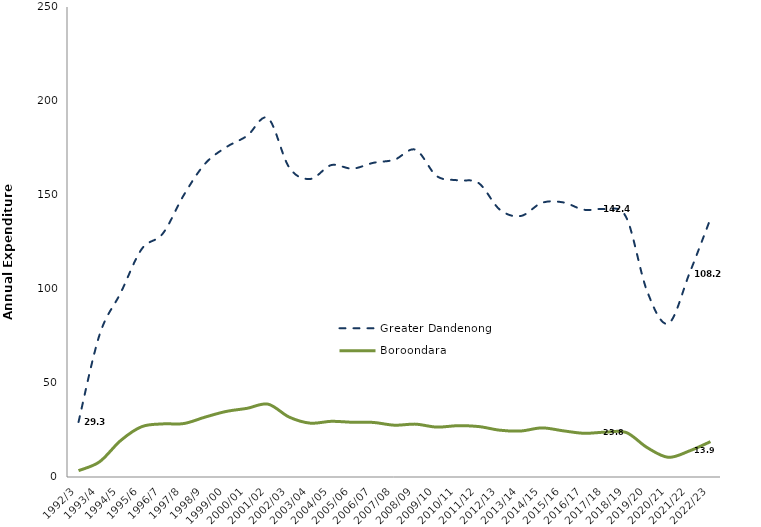
| Category | Greater Dandenong | Boroondara |
|---|---|---|
| 1992/3 | 29.258 | 3.383 |
| 1993/4 | 75.714 | 8.097 |
| 1994/5 | 97.943 | 19.396 |
| 1995/6 | 121.258 | 26.774 |
| 1996/7 | 129.481 | 28.245 |
| 1997/8 | 149.999 | 28.434 |
| 1998/9 | 166.565 | 31.828 |
| 1999/00 | 175.353 | 34.85 |
| 2000/01 | 181.457 | 36.526 |
| 2001/02 | 190.799 | 38.733 |
| 2002/03 | 164.683 | 31.866 |
| 2003/04 | 158.534 | 28.635 |
| 2004/05 | 165.912 | 29.616 |
| 2005/06 | 164.031 | 29.118 |
| 2006/07 | 167.128 | 29.023 |
| 2007/08 | 168.791 | 27.552 |
| 2008/09 | 174.055 | 28.11 |
| 2009/10 | 160.123 | 26.543 |
| 2010/11 | 157.808 | 27.282 |
| 2011/12 | 156.313 | 26.836 |
| 2012/13 | 142.217 | 24.894 |
| 2013/14 | 138.838 | 24.475 |
| 2014/15 | 145.846 | 26.123 |
| 2015/16 | 146.084 | 24.582 |
| 2016/17 | 142.148 | 23.249 |
| 2017/18 | 142.439 | 23.844 |
| 2018/19 | 138.145 | 23.679 |
| 2019/20 | 98.58 | 15.605 |
| 2020/21 | 81.649 | 10.476 |
| 2021/22 | 108.235 | 13.867 |
| 2022/23 | 137.398 | 18.797 |